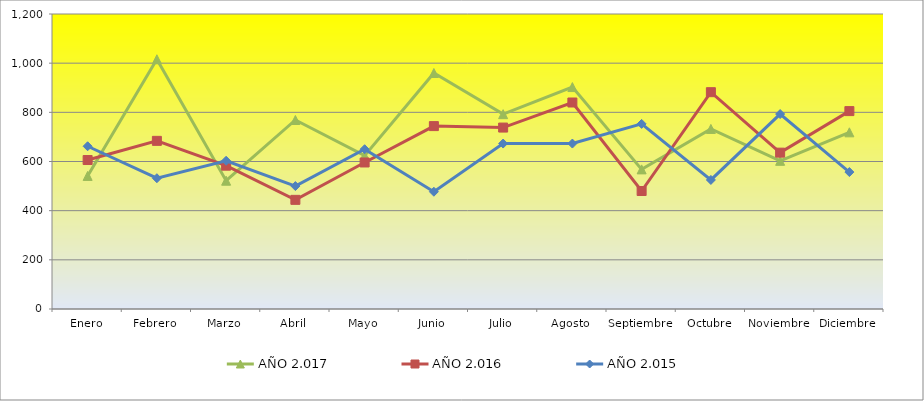
| Category | AÑO 2.017 | AÑO 2.016 | AÑO 2.015 |
|---|---|---|---|
| Enero | 541.395 | 606 | 662 |
| Febrero | 1015.814 | 684 | 532 |
| Marzo | 521.86 | 583 | 603 |
| Abril | 768.837 | 444 | 500 |
| Mayo | 623.721 | 596 | 650 |
| Junio | 960 | 744 | 477 |
| Julio | 792.558 | 738 | 673 |
| Agosto | 902.791 | 840 | 673 |
| Septiembre | 567.907 | 480 | 753 |
| Octubre | 732.558 | 882 | 525 |
| Noviembre | 602.791 | 636 | 793 |
| Diciembre | 718.605 | 805 | 557 |